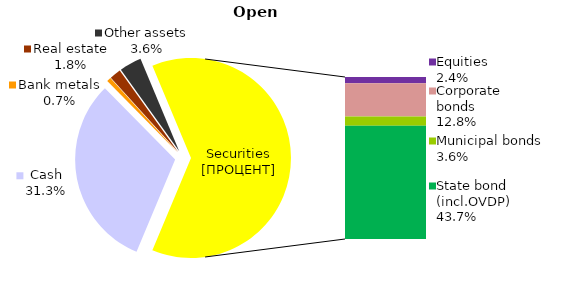
| Category | Open |
|---|---|
| Cash | 496.329 |
| Bank metals | 10.719 |
| Real estate | 28.941 |
| Other assets | 56.838 |
| Equities | 38.358 |
| Corporate bonds | 203.73 |
| Municipal bonds | 57.325 |
| State bond (incl.OVDP) | 693.64 |